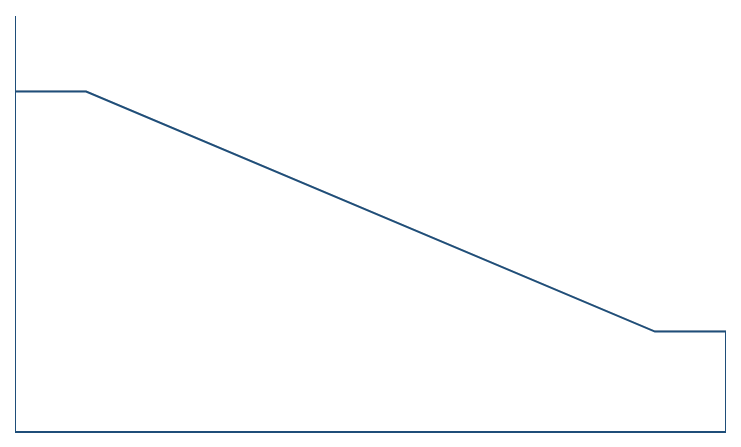
| Category | Series 0 | Series 1 | Series 2 |
|---|---|---|---|
| 0.0 | 727.031 | 9.902 | 3276.228 |
| 10.0 | 727.031 | 9.902 | 3276.228 |
| 90.0 | 3036.759 | 9.902 | 966.499 |
| 100.0 | 3036.759 | 9.902 | 966.499 |